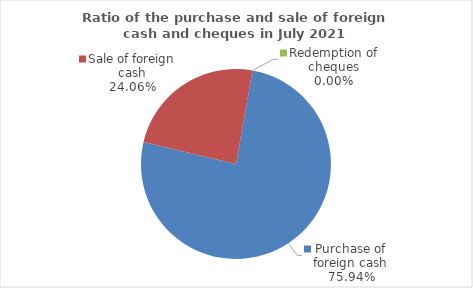
| Category | Series 0 |
|---|---|
| Purchase of foreign cash | 75.936 |
| Sale of foreign cash | 24.064 |
| Redemption of cheques | 0 |